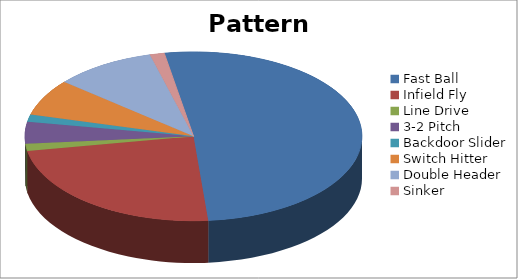
| Category | Pattern Distribution |
|---|---|
| Fast Ball | 37 |
| Infield Fly | 17 |
| Line Drive | 1 |
| 3-2 Pitch | 3 |
| Backdoor Slider | 1 |
| Switch Hitter | 5 |
| Double Header | 7 |
| Sinker | 1 |